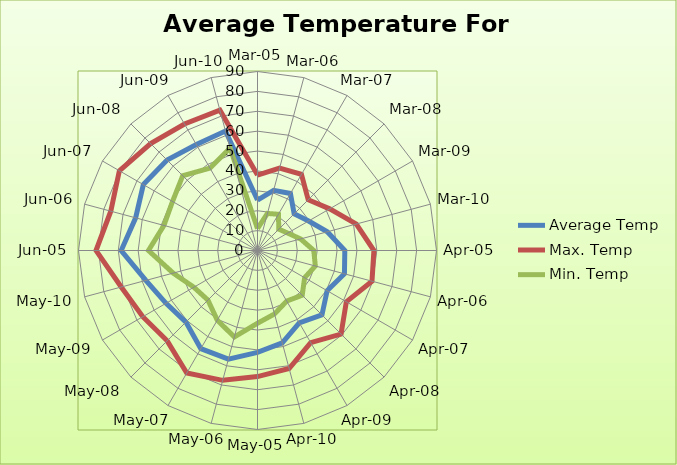
| Category | Average Temp | Max. Temp | Min. Temp |
|---|---|---|---|
| 2005-03-01 | 25.36 | 37.94 | 11 |
| 2006-03-01 | 31.35 | 42.84 | 19.29 |
| 2007-03-01 | 33.11 | 44.19 | 21.03 |
| 2008-03-01 | 26.07 | 36.06 | 15.16 |
| 2009-03-01 | 29.68 | 41.9 | 17.52 |
| 2010-03-01 | 36.33 | 51.45 | 22.45 |
| 2005-04-01 | 43.9 | 58.53 | 28.3 |
| 2006-04-01 | 45.26 | 59.6 | 30.1 |
| 2007-04-01 | 40.42 | 51.57 | 27.37 |
| 2008-04-01 | 45.83 | 59.4 | 31.8 |
| 2009-04-01 | 42 | 53.47 | 29.37 |
| 2010-04-01 | 48.09 | 61.43 | 33.03 |
| 2005-05-01 | 51.22 | 63.39 | 36.58 |
| 2006-05-01 | 56.56 | 67.58 | 45 |
| 2007-05-01 | 56.99 | 71.13 | 40.45 |
| 2008-05-01 | 50.91 | 64.23 | 35.26 |
| 2009-05-01 | 53.09 | 66.61 | 36.94 |
| 2010-05-01 | 58.12 | 70.94 | 43.9 |
| 2005-06-01 | 68.54 | 81.2 | 54.83 |
| 2006-06-01 | 63.43 | 76.37 | 48.7 |
| 2007-06-01 | 66.28 | 80.2 | 49.33 |
| 2008-06-01 | 64.28 | 76 | 53.17 |
| 2009-06-01 | 61.5 | 73.43 | 47.83 |
| 2010-06-01 | 62.19 | 73.04 | 53.33 |